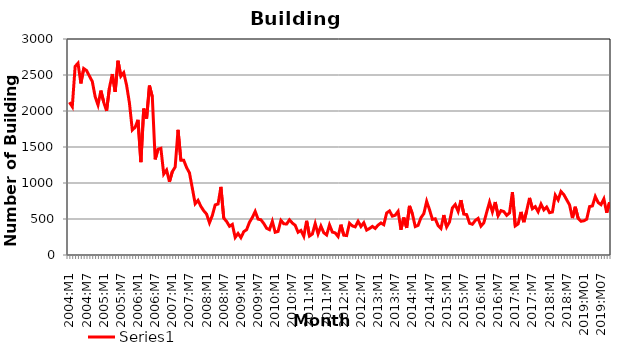
| Category | Series 0 |
|---|---|
| 2004:M1 | 2122 |
| 2004:M2 | 2060 |
| 2004:M3 | 2620 |
| 2004:M4 | 2664 |
| 2004:M5 | 2383 |
| 2004:M6 | 2590 |
| 2004:M7 | 2562 |
| 2004:M8 | 2485 |
| 2004:M9 | 2410 |
| 2004:M10 | 2199 |
| 2004:M11 | 2083 |
| 2004:M12 | 2283 |
| 2005:M1 | 2122 |
| 2005:M2 | 2001 |
| 2005:M3 | 2323 |
| 2005:M4 | 2513 |
| 2005:M5 | 2266 |
| 2005:M6 | 2698 |
| 2005:M7 | 2483 |
| 2005:M8 | 2533 |
| 2005:M9 | 2358 |
| 2005:M10 | 2110 |
| 2005:M11 | 1736 |
| 2005:M12 | 1774 |
| 2006:M1 | 1878 |
| 2006:M2 | 1291 |
| 2006:M3 | 2034 |
| 2006:M4 | 1895 |
| 2006:M5 | 2354 |
| 2006:M6 | 2197 |
| 2006:M7 | 1328 |
| 2006:M8 | 1469 |
| 2006:M9 | 1482 |
| 2006:M10 | 1124 |
| 2006:M11 | 1180 |
| 2006:M12 | 1017 |
| 2007:M1 | 1157 |
| 2007:M2 | 1222 |
| 2007:M3 | 1739 |
| 2007:M4 | 1315 |
| 2007:M5 | 1315 |
| 2007:M6 | 1214 |
| 2007:M7 | 1141 |
| 2007:M8 | 928 |
| 2007:M9 | 712 |
| 2007:M10 | 759 |
| 2007:M11 | 675 |
| 2007:M12 | 614 |
| 2008:M1 | 568 |
| 2008:M2 | 447 |
| 2008:M3 | 549 |
| 2008:M4 | 696 |
| 2008:M5 | 708 |
| 2008:M6 | 946 |
| 2008:M7 | 512 |
| 2008:M8 | 466 |
| 2008:M9 | 399 |
| 2008:M10 | 425 |
| 2008:M11 | 244 |
| 2008:M12 | 299 |
| 2009:M1 | 241 |
| 2009:M2 | 324 |
| 2009:M3 | 352 |
| 2009:M4 | 455 |
| 2009:M5 | 521 |
| 2009:M6 | 605 |
| 2009:M7 | 499 |
| 2009:M8 | 489 |
| 2009:M9 | 438 |
| 2009:M10 | 371 |
| 2009:M11 | 351 |
| 2009:M12 | 468 |
| 2010:M1 | 316 |
| 2010:M2 | 327 |
| 2010:M3 | 481 |
| 2010:M4 | 434 |
| 2010:M5 | 430 |
| 2010:M6 | 489 |
| 2010:M7 | 444 |
| 2010:M8 | 412 |
| 2010:M9 | 316 |
| 2010:M10 | 341 |
| 2010:M11 | 260 |
| 2010:M12 | 475 |
| 2011:M1 | 263 |
| 2011:M2 | 291 |
| 2011:M3 | 436 |
| 2011:M4 | 293 |
| 2011:M5 | 402 |
| 2011:M6 | 309 |
| 2011:M7 | 278 |
| 2011:M8 | 418 |
| 2011:M9 | 318 |
| 2011:M10 | 307 |
| 2011:M11 | 257 |
| 2011:M12 | 421 |
| 2012:M1 | 275 |
| 2012:M2 | 270 |
| 2012:M3 | 441 |
| 2012:M4 | 404 |
| 2012:M5 | 391 |
| 2012:M6 | 468 |
| 2012:M7 | 396 |
| 2012:M8 | 448 |
| 2012:M9 | 346 |
| 2012:M10 | 368 |
| 2012:M11 | 397 |
| 2012:M12 | 369 |
| 2013:M1 | 415 |
| 2013:M2 | 445 |
| 2013:M3 | 421 |
| 2013:M4 | 584 |
| 2013:M5 | 612 |
| 2013:M6 | 539 |
| 2013:M7 | 553 |
| 2013:M8 | 606 |
| 2013:M9 | 351 |
| 2013:M10 | 520 |
| 2013:M11 | 376 |
| 2013:M12 | 682 |
| 2014:M1 | 571 |
| 2014:M2 | 395 |
| 2014:M3 | 412 |
| 2014:M4 | 518 |
| 2014:M5 | 574 |
| 2014:M6 | 745 |
| 2014:M7 | 629 |
| 2014:M8 | 495 |
| 2014:M9 | 503 |
| 2014:M10 | 409 |
| 2014:M11 | 369 |
| 2014:M12 | 555 |
| 2015:M1 | 390 |
| 2015:M2 | 460 |
| 2015:M3 | 654 |
| 2015:M4 | 701 |
| 2015:M5 | 606 |
| 2015:M6 | 762 |
| 2015:M7 | 568 |
| 2015:M8 | 561 |
| 2015:M9 | 440 |
| 2015:M10 | 427 |
| 2015:M11 | 479 |
| 2015:M12 | 508 |
| 2016:M1 | 401 |
| 2016:M2 | 447 |
| 2016:M3 | 593 |
| 2016:M4 | 734 |
| 2016:M5 | 599 |
| 2016:M6 | 736 |
| 2016:M7 | 546 |
| 2016:M8 | 616 |
| 2016:M9 | 603 |
| 2016:M10 | 551 |
| 2016:M11 | 585 |
| 2016:M12 | 874 |
| 2017:M1 | 404 |
| 2017:M2 | 431 |
| 2017:M3 | 598 |
| 2017:M4 | 456 |
| 2017:M5 | 615 |
| 2017:M6 | 793 |
| 2017:M7 | 643 |
| 2017:M8 | 672 |
| 2017:M9 | 601 |
| 2017:M10 | 706 |
| 2017:M11 | 627 |
| 2017:M12 | 665 |
| 2018:M1 | 588 |
| 2018:M2 | 597 |
| 2018:M3 | 831 |
| 2018:M4 | 765 |
| 2018:M5 | 882 |
| 2018:M6 | 838 |
| 2018:M7 | 767 |
| 2018:M8 | 696 |
| 2018:M9 | 513 |
| 2018:M10 | 670 |
| 2018:M11 | 510 |
| 2018:M12 | 468 |
| 2019:M01 | 475 |
| 2019:M02 | 497 |
| 2019:M03 | 672 |
| 2019:M04 | 682 |
| 2019:M05 | 812 |
| 2019:M06 | 729 |
| 2019:M07 | 699 |
| 2019:M08 | 779 |
| 2019:M09 | 587 |
| 2019:M10 | 732 |